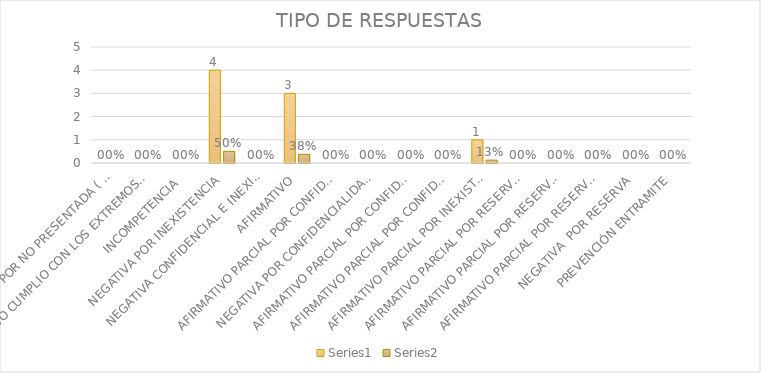
| Category | Series 4 | Series 5 |
|---|---|---|
| SE TIENE POR NO PRESENTADA ( NO CUMPLIÓ PREVENCIÓN) | 0 | 0 |
| NO CUMPLIO CON LOS EXTREMOS DEL ARTÍCULO 79 (REQUISITOS) | 0 | 0 |
| INCOMPETENCIA  | 0 | 0 |
| NEGATIVA POR INEXISTENCIA | 4 | 0.5 |
| NEGATIVA CONFIDENCIAL E INEXISTENTE | 0 | 0 |
| AFIRMATIVO | 3 | 0.375 |
| AFIRMATIVO PARCIAL POR CONFIDENCIALIDAD  | 0 | 0 |
| NEGATIVA POR CONFIDENCIALIDAD Y RESERVADA | 0 | 0 |
| AFIRMATIVO PARCIAL POR CONFIDENCIALIDAD E INEXISTENCIA | 0 | 0 |
| AFIRMATIVO PARCIAL POR CONFIDENCIALIDAD, RESERVA E INEXISTENCIA | 0 | 0 |
| AFIRMATIVO PARCIAL POR INEXISTENCIA | 1 | 0.125 |
| AFIRMATIVO PARCIAL POR RESERVA | 0 | 0 |
| AFIRMATIVO PARCIAL POR RESERVA Y CONFIDENCIALIDAD | 0 | 0 |
| AFIRMATIVO PARCIAL POR RESERVA E INEXISTENCIA | 0 | 0 |
| NEGATIVA  POR RESERVA | 0 | 0 |
| PREVENCIÓN ENTRAMITE | 0 | 0 |